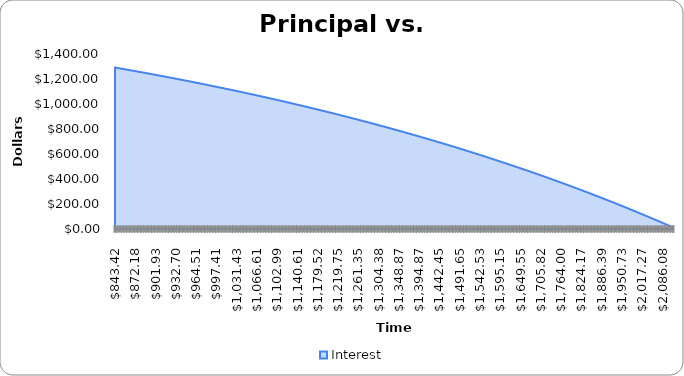
| Category | Interest |
|---|---|
| 843.4153278568158 | 1291.667 |
| 845.5941507871128 | 1289.488 |
| 847.7786023433127 | 1287.303 |
| 849.968697066033 | 1285.113 |
| 852.1644495334533 | 1282.918 |
| 854.3658743614149 | 1280.716 |
| 856.5729862035153 | 1278.509 |
| 858.7857997512076 | 1276.296 |
| 861.0043297338984 | 1274.078 |
| 863.2285909190443 | 1271.853 |
| 865.4585981122518 | 1269.623 |
| 867.6943661573753 | 1267.388 |
| 869.9359099366152 | 1265.146 |
| 872.183244370618 | 1262.899 |
| 874.4363844185755 | 1260.646 |
| 876.6953450783235 | 1258.387 |
| 878.9601413864425 | 1256.122 |
| 881.2307884183574 | 1253.851 |
| 883.5073012884382 | 1251.575 |
| 885.7896951501 | 1249.292 |
| 888.0779851959044 | 1247.004 |
| 890.3721866576604 | 1244.71 |
| 892.6723148065262 | 1242.41 |
| 894.9783849531098 | 1240.104 |
| 897.290412447572 | 1237.792 |
| 899.6084126797282 | 1235.474 |
| 901.9324010791508 | 1233.15 |
| 904.2623931152721 | 1230.82 |
| 906.5984042974865 | 1228.484 |
| 908.9404501752549 | 1226.142 |
| 911.2885463382077 | 1223.793 |
| 913.6427084162481 | 1221.439 |
| 916.0029520796568 | 1219.079 |
| 918.369293039196 | 1216.713 |
| 920.7417470462137 | 1214.34 |
| 923.1203298927499 | 1211.962 |
| 925.5050574116394 | 1209.577 |
| 927.8959454766195 | 1207.186 |
| 930.2930100024341 | 1204.789 |
| 932.6962669449404 | 1202.386 |
| 935.1057323012146 | 1199.976 |
| 937.5214221096594 | 1197.561 |
| 939.9433524501094 | 1195.139 |
| 942.3715394439389 | 1192.71 |
| 944.8059992541691 | 1190.276 |
| 947.2467480855757 | 1187.835 |
| 949.6938021847968 | 1185.388 |
| 952.1471778404409 | 1182.935 |
| 954.6068913831953 | 1180.475 |
| 957.0729591859354 | 1178.009 |
| 959.5453976638323 | 1175.537 |
| 962.0242232744638 | 1173.058 |
| 964.5094525179227 | 1170.573 |
| 967.0011019369274 | 1168.081 |
| 969.499188116931 | 1165.583 |
| 972.0037276862331 | 1163.078 |
| 974.5147373160892 | 1160.567 |
| 977.0322337208224 | 1158.05 |
| 979.5562336579346 | 1155.526 |
| 982.0867539282176 | 1152.995 |
| 984.6238113758654 | 1150.458 |
| 987.1674228885865 | 1147.915 |
| 989.7176053977153 | 1145.364 |
| 992.274375878326 | 1142.808 |
| 994.8377513493451 | 1140.244 |
| 997.4077488736641 | 1137.674 |
| 999.9843855582544 | 1135.098 |
| 1002.5676785542798 | 1132.514 |
| 1005.1576450572118 | 1129.924 |
| 1007.7543023069427 | 1127.328 |
| 1010.3576675879024 | 1124.724 |
| 1012.9677582291711 | 1122.114 |
| 1015.5845916045964 | 1119.497 |
| 1018.2081851329083 | 1116.874 |
| 1020.8385562778349 | 1114.243 |
| 1023.4757225482194 | 1111.606 |
| 1026.1197014981356 | 1108.962 |
| 1028.7705107270058 | 1106.311 |
| 1031.4281678797172 | 1103.654 |
| 1034.0926906467398 | 1100.989 |
| 1036.764096764244 | 1098.318 |
| 1039.4424040142183 | 1095.64 |
| 1042.1276302245883 | 1092.954 |
| 1044.8197932693352 | 1090.262 |
| 1047.5189110686142 | 1087.563 |
| 1050.2250015888749 | 1084.857 |
| 1052.9380828429794 | 1082.144 |
| 1055.6581728903238 | 1079.424 |
| 1058.385289836957 | 1076.697 |
| 1061.1194518357026 | 1073.963 |
| 1063.8606770862782 | 1071.221 |
| 1066.6089838354178 | 1068.473 |
| 1069.3643903769926 | 1065.718 |
| 1072.1269150521332 | 1062.955 |
| 1074.8965762493513 | 1060.185 |
| 1077.6733924046619 | 1057.409 |
| 1080.4573820017074 | 1054.625 |
| 1083.2485635718783 | 1051.833 |
| 1086.046955694439 | 1049.035 |
| 1088.8525769966498 | 1046.229 |
| 1091.6654461538913 | 1043.417 |
| 1094.4855818897888 | 1040.596 |
| 1097.3130029763374 | 1037.769 |
| 1100.1477282340263 | 1034.934 |
| 1102.9897765319643 | 1032.092 |
| 1105.839166788005 | 1029.243 |
| 1108.695917968874 | 1026.386 |
| 1111.5600490902937 | 1023.522 |
| 1114.4315792171103 | 1020.65 |
| 1117.310527463421 | 1017.771 |
| 1120.1969129927015 | 1014.885 |
| 1123.0907550179327 | 1011.991 |
| 1125.9920728017291 | 1009.09 |
| 1128.900885656467 | 1006.181 |
| 1131.8172129444129 | 1003.265 |
| 1134.7410740778525 | 1000.341 |
| 1137.6724885192202 | 997.41 |
| 1140.6114757812284 | 994.471 |
| 1143.5580554269964 | 991.524 |
| 1146.5122470701829 | 988.57 |
| 1149.4740703751143 | 985.608 |
| 1152.4435450569165 | 982.638 |
| 1155.4206908816468 | 979.661 |
| 1158.4055276664244 | 976.676 |
| 1161.3980752795628 | 973.684 |
| 1164.3983536407018 | 970.684 |
| 1167.4063827209402 | 967.676 |
| 1170.422182542969 | 964.66 |
| 1173.4457731812051 | 961.636 |
| 1176.4771747619234 | 958.605 |
| 1179.5164074633917 | 955.566 |
| 1182.5634915160053 | 952.519 |
| 1185.6184472024217 | 949.464 |
| 1188.6812948576949 | 946.401 |
| 1191.7520548694106 | 943.33 |
| 1194.8307476778232 | 940.251 |
| 1197.9173937759908 | 937.165 |
| 1201.012013709912 | 934.07 |
| 1204.114628078663 | 930.967 |
| 1207.2252575345328 | 927.857 |
| 1210.3439227831636 | 924.738 |
| 1213.4706445836869 | 921.611 |
| 1216.6054437488613 | 918.477 |
| 1219.7483411452126 | 915.334 |
| 1222.8993576931712 | 912.183 |
| 1226.0585143672115 | 909.023 |
| 1229.2258321959935 | 905.856 |
| 1232.4013322625 | 902.681 |
| 1235.5850357041782 | 899.497 |
| 1238.7769637130805 | 896.305 |
| 1241.977137536006 | 893.105 |
| 1245.1855784746406 | 889.896 |
| 1248.4023078857 | 886.68 |
| 1251.6273471810714 | 883.455 |
| 1254.860717827956 | 880.221 |
| 1258.1024413490118 | 876.98 |
| 1261.3525393224966 | 873.729 |
| 1264.611033382413 | 870.471 |
| 1267.877945218651 | 867.204 |
| 1271.1532965771326 | 863.929 |
| 1274.4371092599567 | 860.645 |
| 1277.7294051255449 | 857.353 |
| 1281.0302060887857 | 854.052 |
| 1284.3395341211817 | 850.742 |
| 1287.6574112509948 | 847.425 |
| 1290.9838595633933 | 844.098 |
| 1294.3189012005987 | 840.763 |
| 1297.6625583620337 | 837.419 |
| 1301.014853304469 | 834.067 |
| 1304.3758083421721 | 830.706 |
| 1307.745445847056 | 827.337 |
| 1311.1237882488276 | 823.958 |
| 1314.510858035137 | 820.571 |
| 1317.9066777517278 | 817.175 |
| 1321.3112700025865 | 813.771 |
| 1324.7246574500932 | 810.357 |
| 1328.1468628151727 | 806.935 |
| 1331.5779088774452 | 803.504 |
| 1335.0178184753786 | 800.064 |
| 1338.46661450644 | 796.615 |
| 1341.9243199272482 | 793.158 |
| 1345.390957753727 | 789.691 |
| 1348.8665510612573 | 786.215 |
| 1352.3511229848323 | 782.731 |
| 1355.8446967192099 | 779.237 |
| 1359.3472955190678 | 775.735 |
| 1362.858942699159 | 772.223 |
| 1366.3796616344648 | 768.702 |
| 1369.9094757603539 | 765.173 |
| 1373.448408572735 | 761.634 |
| 1376.9964836282145 | 758.086 |
| 1380.553724544254 | 754.528 |
| 1384.1201549993266 | 750.962 |
| 1387.6957987330748 | 747.386 |
| 1391.2806795464687 | 743.801 |
| 1394.8748213019637 | 740.207 |
| 1398.4782479236605 | 736.604 |
| 1402.0909833974633 | 732.991 |
| 1405.7130517712399 | 729.369 |
| 1409.3444771549823 | 725.738 |
| 1412.985283720966 | 722.097 |
| 1416.6354957039116 | 718.446 |
| 1420.2951374011468 | 714.787 |
| 1423.9642331727664 | 711.118 |
| 1427.642807441796 | 707.439 |
| 1431.3308846943542 | 703.751 |
| 1435.0284894798147 | 700.054 |
| 1438.7356464109707 | 696.346 |
| 1442.452380164199 | 692.63 |
| 1446.178715479623 | 688.903 |
| 1449.9146771612786 | 685.167 |
| 1453.6602900772787 | 681.422 |
| 1457.4155791599783 | 677.666 |
| 1461.1805694061416 | 673.901 |
| 1464.9552858771076 | 670.127 |
| 1468.7397536989565 | 666.342 |
| 1472.533998062679 | 662.548 |
| 1476.338044224341 | 658.744 |
| 1480.1519175052538 | 654.93 |
| 1483.9756432921422 | 651.106 |
| 1487.8092470373138 | 647.273 |
| 1491.652754258827 | 643.429 |
| 1495.5061905406621 | 639.576 |
| 1499.3695815328922 | 635.712 |
| 1503.2429529518522 | 631.839 |
| 1507.126330580311 | 627.956 |
| 1511.0197402676436 | 624.062 |
| 1514.9232079300018 | 620.159 |
| 1518.8367595504874 | 616.245 |
| 1522.7604211793264 | 612.322 |
| 1526.6942189340396 | 608.388 |
| 1530.638178999619 | 604.444 |
| 1534.5923276287015 | 600.49 |
| 1538.5566911417422 | 596.525 |
| 1542.5312959271919 | 592.551 |
| 1546.5161684416703 | 588.566 |
| 1550.5113352101448 | 584.571 |
| 1554.516822826104 | 580.565 |
| 1558.5326579517382 | 576.549 |
| 1562.5588673181137 | 572.523 |
| 1566.595477725352 | 568.487 |
| 1570.6425160428093 | 564.439 |
| 1574.700009209253 | 560.382 |
| 1578.7679842330438 | 556.314 |
| 1582.8464681923124 | 552.236 |
| 1586.9354882351427 | 548.147 |
| 1591.03507157975 | 544.047 |
| 1595.1452455146643 | 539.937 |
| 1599.2660373989106 | 535.816 |
| 1603.3974746621911 | 531.685 |
| 1607.5395848050684 | 527.542 |
| 1611.6923953991482 | 523.39 |
| 1615.8559340872628 | 519.226 |
| 1620.030228583655 | 515.052 |
| 1624.2153066741628 | 510.867 |
| 1628.4111962164043 | 506.671 |
| 1632.6179251399633 | 502.464 |
| 1636.8355214465748 | 498.246 |
| 1641.064013210312 | 494.018 |
| 1645.303428577772 | 489.779 |
| 1649.5537957682645 | 485.528 |
| 1653.815143073999 | 481.267 |
| 1658.0874988602736 | 476.994 |
| 1662.3708915656628 | 472.711 |
| 1666.6653497022073 | 468.417 |
| 1670.9709018556046 | 464.111 |
| 1675.2875766853983 | 459.794 |
| 1679.6154029251688 | 455.467 |
| 1683.9544093827258 | 451.128 |
| 1688.3046249402978 | 446.777 |
| 1692.6660785547267 | 442.416 |
| 1697.0387992576598 | 438.043 |
| 1701.422816155742 | 433.659 |
| 1705.818158430811 | 429.264 |
| 1710.2248553400907 | 424.857 |
| 1714.6429362163858 | 420.439 |
| 1719.0724304682783 | 416.01 |
| 1723.5133675803213 | 411.569 |
| 1727.965777113237 | 407.116 |
| 1732.429688704113 | 402.652 |
| 1736.9051320665985 | 398.177 |
| 1741.392136991104 | 393.69 |
| 1745.8907333449977 | 389.191 |
| 1750.4009510728056 | 384.681 |
| 1754.9228201964104 | 380.159 |
| 1759.4563708152511 | 375.626 |
| 1764.0016331065237 | 371.08 |
| 1768.5586373253823 | 366.523 |
| 1773.1274138051397 | 361.955 |
| 1777.7079929574695 | 357.374 |
| 1782.3004052726096 | 352.782 |
| 1786.904681319564 | 348.177 |
| 1791.520851746306 | 343.561 |
| 1796.148947279984 | 338.933 |
| 1800.7889987271242 | 334.293 |
| 1805.4410369738357 | 329.641 |
| 1810.1050929860182 | 324.977 |
| 1814.7811978095654 | 320.301 |
| 1819.4693825705735 | 315.613 |
| 1824.1696784755475 | 310.912 |
| 1828.8821168116092 | 306.2 |
| 1833.606728946706 | 301.475 |
| 1838.3435463298183 | 296.738 |
| 1843.0926004911703 | 291.989 |
| 1847.8539230424392 | 287.228 |
| 1852.6275456769654 | 282.454 |
| 1857.4135001699642 | 277.668 |
| 1862.2118183787368 | 272.87 |
| 1867.0225322428819 | 268.059 |
| 1871.8456737845092 | 263.236 |
| 1876.6812751084526 | 258.401 |
| 1881.5293684024828 | 253.553 |
| 1886.3899859375224 | 248.692 |
| 1891.263160067861 | 243.819 |
| 1896.1489232313697 | 238.933 |
| 1901.0473079497174 | 234.035 |
| 1905.9583468285875 | 229.124 |
| 1910.8820725578946 | 224.2 |
| 1915.8185179120026 | 219.263 |
| 1920.767715749942 | 214.314 |
| 1925.7296990156292 | 209.352 |
| 1930.7045007380864 | 204.377 |
| 1935.6921540316598 | 199.39 |
| 1940.6926920962414 | 194.389 |
| 1945.7061482174902 | 189.376 |
| 1950.732555767052 | 184.349 |
| 1955.7719482027835 | 179.31 |
| 1960.824359068974 | 174.258 |
| 1965.889821996569 | 169.192 |
| 1970.9683707033935 | 164.114 |
| 1976.0600389943772 | 159.022 |
| 1981.1648607617794 | 153.917 |
| 1986.282869985414 | 148.799 |
| 1991.4141007328762 | 143.668 |
| 1996.5585871597696 | 138.523 |
| 2001.7163635099323 | 133.366 |
| 2006.8874641156663 | 128.195 |
| 2012.071923397965 | 123.01 |
| 2017.2697758667432 | 117.812 |
| 2022.4810561210654 | 112.601 |
| 2027.7057988493782 | 107.376 |
| 2032.9440388297392 | 102.138 |
| 2038.1958109300494 | 96.886 |
| 2043.4611501082852 | 91.621 |
| 2048.7400914127315 | 86.342 |
| 2054.0326699822144 | 81.049 |
| 2059.338921046335 | 75.743 |
| 2064.658879925705 | 70.423 |
| 2069.9925820321796 | 65.089 |
| 2075.340062869096 | 59.742 |
| 2080.701358031508 | 54.381 |
| 2086.076503206423 | 49.005 |
| 2091.4655341730395 | 43.616 |
| 2096.8684868029864 | 38.214 |
| 2102.2853970605606 | 32.797 |
| 2107.716301002967 | 27.366 |
| 2113.161234780558 | 21.921 |
| 2118.6202346370746 | 16.462 |
| 2124.093336909887 | 10.989 |
| 2129.5805780302376 | 5.501 |